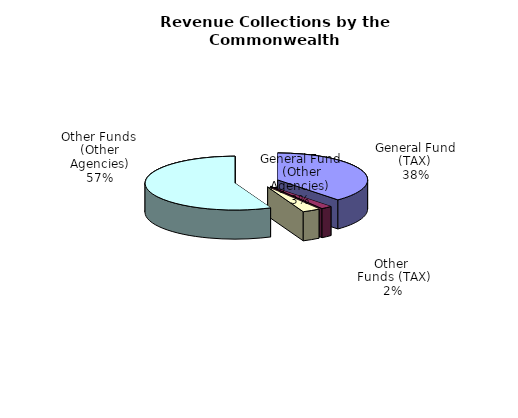
| Category | Series 0 |
|---|---|
| General Fund | 14938089000 |
| All Other Funds | 786987000 |
| General Fund | 1243862000 |
| All Other Funds | 22015595000 |